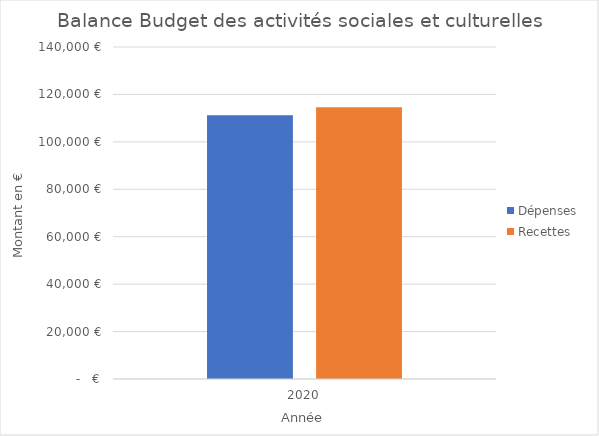
| Category |  Dépenses   |  Recettes  |
|---|---|---|
| 0 | 111200 | 114595 |